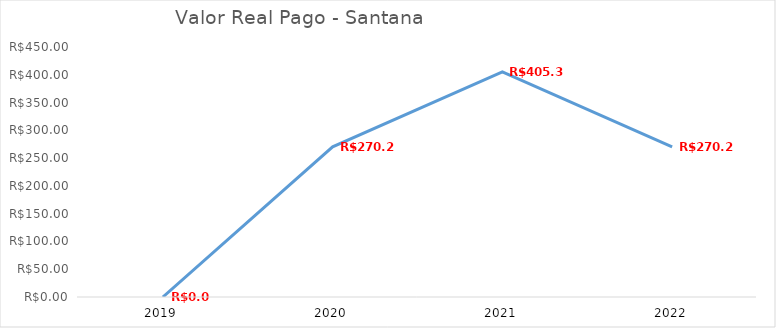
| Category | Series 0 |
|---|---|
| 2019.0 | 0 |
| 2020.0 | 270.26 |
| 2021.0 | 405.39 |
| 2022.0 | 270.26 |